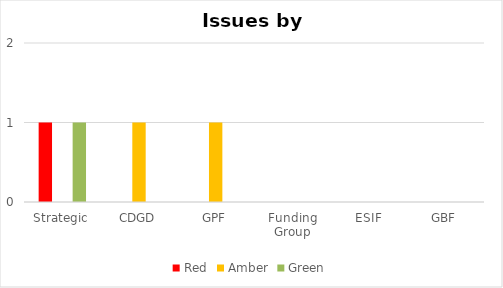
| Category | Red | Amber | Green |
|---|---|---|---|
| Strategic | 1 | 0 | 1 |
| CDGD | 0 | 1 | 0 |
| GPF | 0 | 1 | 0 |
| Funding Group | 0 | 0 | 0 |
| ESIF | 0 | 0 | 0 |
| GBF | 0 | 0 | 0 |